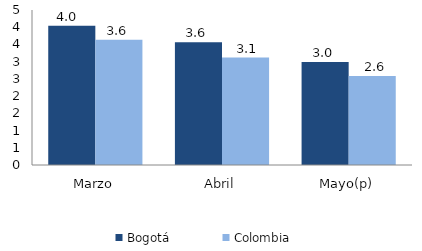
| Category | Bogotá | Colombia |
|---|---|---|
| Marzo | 4.046 | 3.638 |
| Abril | 3.563 | 3.118 |
| Mayo(p) | 2.991 | 2.584 |